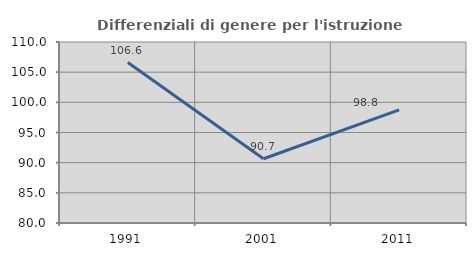
| Category | Differenziali di genere per l'istruzione superiore |
|---|---|
| 1991.0 | 106.587 |
| 2001.0 | 90.655 |
| 2011.0 | 98.752 |